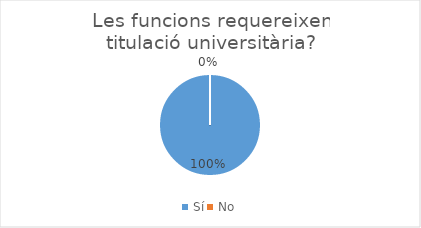
| Category | Series 0 |
|---|---|
| Sí | 1 |
| No | 0 |